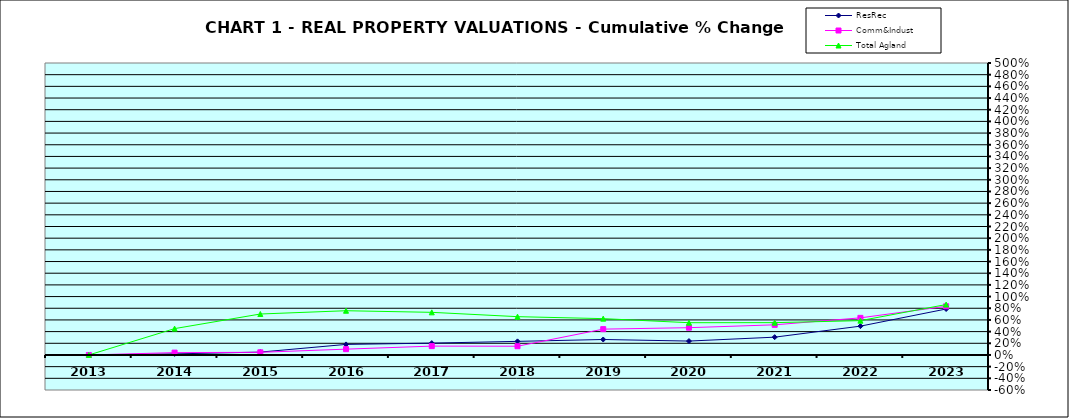
| Category | ResRec | Comm&Indust | Total Agland |
|---|---|---|---|
| 2013.0 | 0 | 0 | 0 |
| 2014.0 | 0.019 | 0.04 | 0.451 |
| 2015.0 | 0.049 | 0.045 | 0.701 |
| 2016.0 | 0.181 | 0.099 | 0.758 |
| 2017.0 | 0.203 | 0.151 | 0.73 |
| 2018.0 | 0.233 | 0.15 | 0.656 |
| 2019.0 | 0.265 | 0.442 | 0.622 |
| 2020.0 | 0.238 | 0.467 | 0.552 |
| 2021.0 | 0.305 | 0.516 | 0.554 |
| 2022.0 | 0.494 | 0.636 | 0.588 |
| 2023.0 | 0.787 | 0.834 | 0.863 |